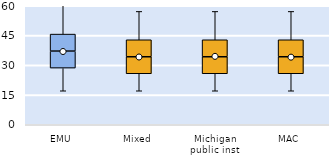
| Category | 25th | 50th | 75th |
|---|---|---|---|
| EMU | 28.571 | 8.571 | 8.571 |
| Mixed | 25.714 | 8.571 | 8.571 |
| Michigan public inst | 25.714 | 8.571 | 8.571 |
| MAC | 25.714 | 8.571 | 8.571 |